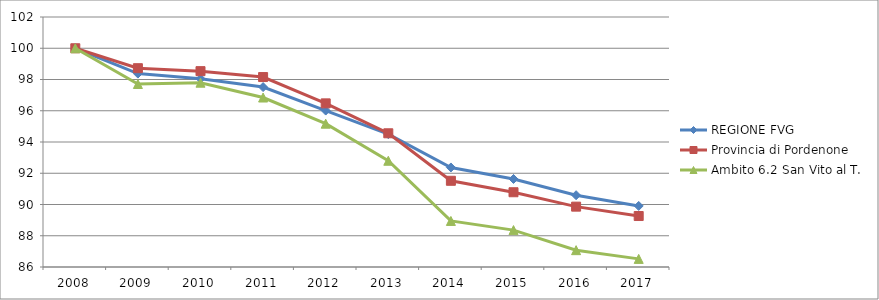
| Category | REGIONE FVG | Provincia di Pordenone | Ambito 6.2 San Vito al T. |
|---|---|---|---|
| 2008.0 | 100 | 100 | 100 |
| 2009.0 | 98.378 | 98.723 | 97.711 |
| 2010.0 | 98.049 | 98.535 | 97.795 |
| 2011.0 | 97.515 | 98.157 | 96.846 |
| 2012.0 | 96.012 | 96.472 | 95.172 |
| 2013.0 | 94.5 | 94.558 | 92.799 |
| 2014.0 | 92.37 | 91.517 | 88.948 |
| 2015.0 | 91.632 | 90.784 | 88.362 |
| 2016.0 | 90.595 | 89.863 | 87.078 |
| 2017.0 | 89.908 | 89.262 | 86.52 |